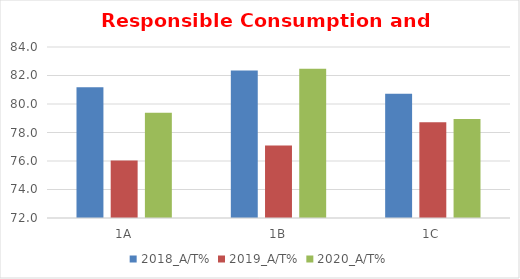
| Category | 2018_A/T% | 2019_A/T% | 2020_A/T% |
|---|---|---|---|
| 1A | 81.176 | 76.042 | 79.381 |
| 1B | 82.353 | 77.083 | 82.474 |
| 1C | 80.723 | 78.723 | 78.947 |